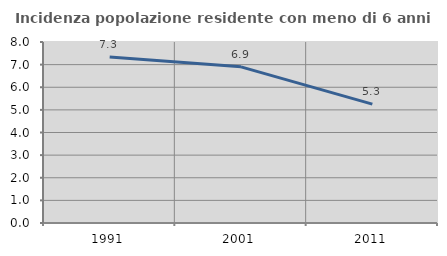
| Category | Incidenza popolazione residente con meno di 6 anni |
|---|---|
| 1991.0 | 7.341 |
| 2001.0 | 6.901 |
| 2011.0 | 5.256 |